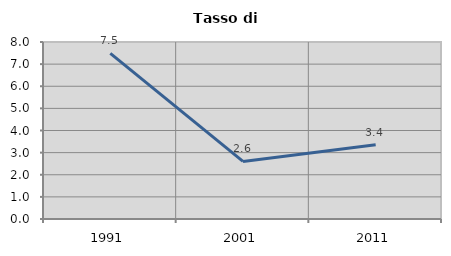
| Category | Tasso di disoccupazione   |
|---|---|
| 1991.0 | 7.485 |
| 2001.0 | 2.601 |
| 2011.0 | 3.359 |